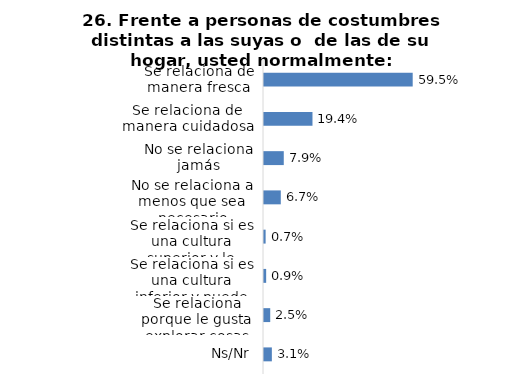
| Category | Series 0 |
|---|---|
| Se relaciona de manera fresca | 0.595 |
| Se relaciona de manera cuidadosa | 0.194 |
| No se relaciona jamás | 0.079 |
| No se relaciona a menos que sea necesario | 0.067 |
| Se relaciona si es una cultura superior y le conviene | 0.007 |
| Se relaciona si es una cultura inferior y puede ayudarle | 0.009 |
| Se relaciona porque le gusta explorar cosas desconocidas | 0.025 |
| Ns/Nr | 0.031 |